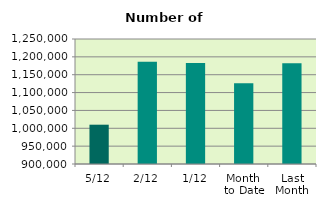
| Category | Series 0 |
|---|---|
| 5/12 | 1010054 |
| 2/12 | 1186002 |
| 1/12 | 1182962 |
| Month 
to Date | 1126339.333 |
| Last
Month | 1182027.273 |